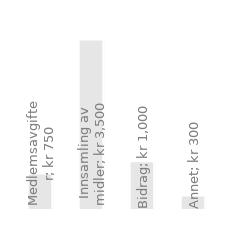
| Category | Årlige inntekter |
|---|---|
| Medlemsavgifter | 750 |
| Innsamling av midler | 3500 |
| Bidrag | 1000 |
| Annet | 300 |